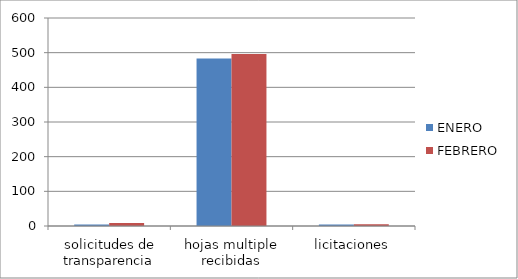
| Category | ENERO | FEBRERO |
|---|---|---|
| solicitudes de transparencia | 4 | 9 |
| hojas multiple recibidas | 483 | 496 |
| licitaciones | 4 | 5 |